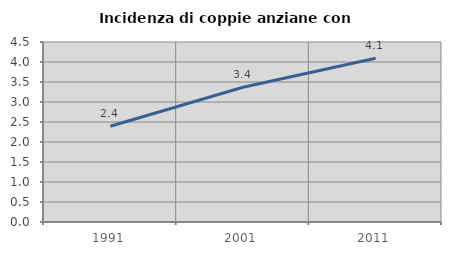
| Category | Incidenza di coppie anziane con figli |
|---|---|
| 1991.0 | 2.393 |
| 2001.0 | 3.367 |
| 2011.0 | 4.093 |